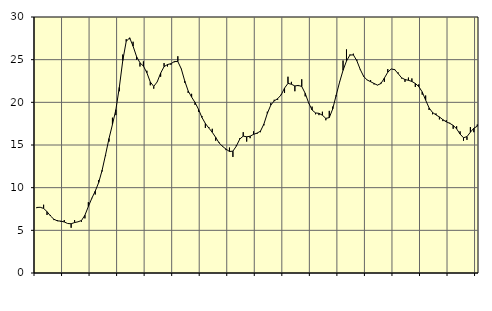
| Category | Piggar | Series 1 |
|---|---|---|
| nan | 7.6 | 7.68 |
| 87.0 | 7.7 | 7.7 |
| 87.0 | 8 | 7.57 |
| 87.0 | 6.8 | 7.19 |
| nan | 6.8 | 6.68 |
| 88.0 | 6.2 | 6.3 |
| 88.0 | 6.2 | 6.11 |
| 88.0 | 6 | 6.08 |
| nan | 6.2 | 5.98 |
| 89.0 | 5.8 | 5.8 |
| 89.0 | 5.3 | 5.77 |
| 89.0 | 6.2 | 5.91 |
| nan | 6 | 6 |
| 90.0 | 6 | 6.15 |
| 90.0 | 6.4 | 6.77 |
| 90.0 | 8.3 | 7.79 |
| nan | 8.8 | 8.75 |
| 91.0 | 9.2 | 9.59 |
| 91.0 | 10.9 | 10.6 |
| 91.0 | 11.9 | 12.04 |
| nan | 13.7 | 13.86 |
| 92.0 | 15.4 | 15.76 |
| 92.0 | 18.2 | 17.4 |
| 92.0 | 18.5 | 19.14 |
| nan | 21.3 | 21.76 |
| 93.0 | 25.6 | 24.9 |
| 93.0 | 27.4 | 27.14 |
| 93.0 | 27.4 | 27.56 |
| nan | 27.1 | 26.58 |
| 94.0 | 25 | 25.37 |
| 94.0 | 24.2 | 24.63 |
| 94.0 | 24.8 | 24.25 |
| nan | 23.7 | 23.47 |
| 95.0 | 22 | 22.38 |
| 95.0 | 21.6 | 21.87 |
| 95.0 | 22.4 | 22.39 |
| nan | 23 | 23.42 |
| 96.0 | 24.6 | 24.18 |
| 96.0 | 24.2 | 24.43 |
| 96.0 | 24.4 | 24.53 |
| nan | 24.7 | 24.78 |
| 97.0 | 25.4 | 24.78 |
| 97.0 | 23.9 | 23.93 |
| 97.0 | 22.3 | 22.51 |
| nan | 21.1 | 21.34 |
| 98.0 | 21 | 20.62 |
| 98.0 | 19.7 | 19.98 |
| 98.0 | 18.9 | 19.19 |
| nan | 18.4 | 18.23 |
| 99.0 | 17 | 17.52 |
| 99.0 | 17.1 | 16.99 |
| 99.0 | 16.9 | 16.49 |
| nan | 15.5 | 15.89 |
| 0.0 | 15.3 | 15.24 |
| 0.0 | 14.9 | 14.83 |
| 0.0 | 14.4 | 14.52 |
| nan | 14.7 | 14.24 |
| 1.0 | 13.6 | 14.28 |
| 1.0 | 15 | 14.87 |
| 1.0 | 15.8 | 15.7 |
| nan | 16.5 | 16.04 |
| 2.0 | 15.4 | 15.96 |
| 2.0 | 15.8 | 16.03 |
| 2.0 | 16.6 | 16.25 |
| nan | 16.3 | 16.39 |
| 3.0 | 16.5 | 16.62 |
| 3.0 | 17.3 | 17.45 |
| 3.0 | 18.9 | 18.7 |
| nan | 19.9 | 19.67 |
| 4.0 | 20.3 | 20.17 |
| 4.0 | 20.3 | 20.43 |
| 4.0 | 20.9 | 20.86 |
| nan | 21.1 | 21.67 |
| 5.0 | 23 | 22.22 |
| 5.0 | 22.4 | 22.12 |
| 5.0 | 21.3 | 21.92 |
| nan | 21.9 | 21.98 |
| 6.0 | 22.7 | 21.86 |
| 6.0 | 20.7 | 21.06 |
| 6.0 | 19.9 | 19.94 |
| nan | 19.5 | 19.1 |
| 7.0 | 18.6 | 18.76 |
| 7.0 | 18.5 | 18.71 |
| 7.0 | 18.9 | 18.49 |
| nan | 17.9 | 18.12 |
| 8.0 | 19 | 18.21 |
| 8.0 | 19.5 | 19.23 |
| 8.0 | 20.7 | 20.83 |
| nan | 22.4 | 22.37 |
| 9.0 | 24.9 | 23.75 |
| 9.0 | 26.2 | 24.84 |
| 9.0 | 25.6 | 25.54 |
| nan | 25.7 | 25.56 |
| 10.0 | 25 | 24.88 |
| 10.0 | 23.9 | 23.85 |
| 10.0 | 23.1 | 23.03 |
| nan | 22.6 | 22.62 |
| 11.0 | 22.6 | 22.42 |
| 11.0 | 22.1 | 22.21 |
| 11.0 | 22 | 22.02 |
| nan | 22.3 | 22.2 |
| 12.0 | 22.4 | 22.84 |
| 12.0 | 23.9 | 23.53 |
| 12.0 | 23.9 | 23.91 |
| nan | 23.9 | 23.83 |
| 13.0 | 23.5 | 23.37 |
| 13.0 | 22.8 | 22.88 |
| 13.0 | 22.4 | 22.67 |
| nan | 22.9 | 22.58 |
| 14.0 | 22.8 | 22.45 |
| 14.0 | 21.8 | 22.21 |
| 14.0 | 22.1 | 21.85 |
| nan | 20.9 | 21.22 |
| 15.0 | 20.8 | 20.26 |
| 15.0 | 19.1 | 19.35 |
| 15.0 | 18.6 | 18.81 |
| nan | 18.7 | 18.53 |
| 16.0 | 18 | 18.29 |
| 16.0 | 17.8 | 17.97 |
| 16.0 | 17.9 | 17.71 |
| nan | 17.6 | 17.54 |
| 17.0 | 16.9 | 17.3 |
| 17.0 | 17.2 | 16.89 |
| 17.0 | 16.6 | 16.28 |
| nan | 15.5 | 15.85 |
| 18.0 | 15.6 | 15.98 |
| 18.0 | 17.1 | 16.5 |
| 18.0 | 16.5 | 16.97 |
| nan | 17.4 | 17.2 |